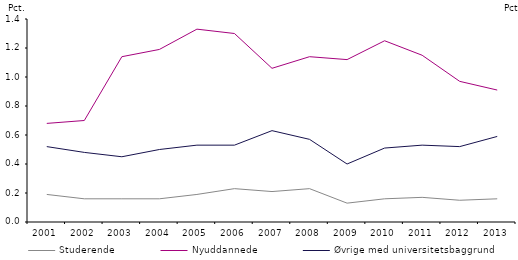
| Category | Studerende | Nyuddannede | Øvrige med universitetsbaggrund |
|---|---|---|---|
| 2001.0 | 0.19 | 0.68 | 0.52 |
| 2002.0 | 0.16 | 0.7 | 0.48 |
| 2003.0 | 0.16 | 1.14 | 0.45 |
| 2004.0 | 0.16 | 1.19 | 0.5 |
| 2005.0 | 0.19 | 1.33 | 0.53 |
| 2006.0 | 0.23 | 1.3 | 0.53 |
| 2007.0 | 0.21 | 1.06 | 0.63 |
| 2008.0 | 0.23 | 1.14 | 0.57 |
| 2009.0 | 0.13 | 1.12 | 0.4 |
| 2010.0 | 0.16 | 1.25 | 0.51 |
| 2011.0 | 0.17 | 1.15 | 0.53 |
| 2012.0 | 0.15 | 0.97 | 0.52 |
| 2013.0 | 0.16 | 0.91 | 0.59 |